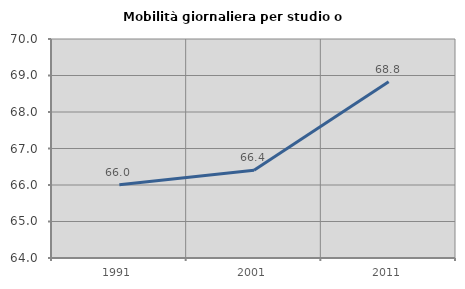
| Category | Mobilità giornaliera per studio o lavoro |
|---|---|
| 1991.0 | 66.01 |
| 2001.0 | 66.405 |
| 2011.0 | 68.83 |